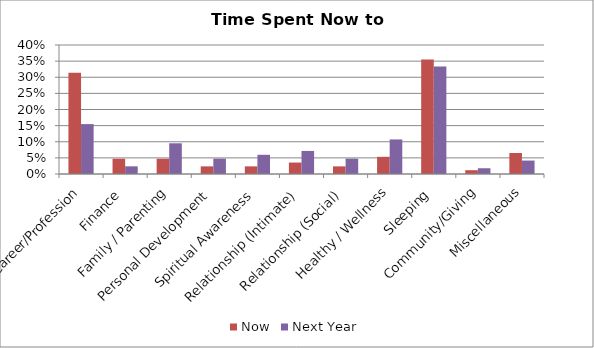
| Category | Now | Next Year |
|---|---|---|
| Career/Profession | 0.314 | 0.155 |
| Finance | 0.047 | 0.024 |
| Family / Parenting | 0.047 | 0.095 |
| Personal Development | 0.024 | 0.048 |
| Spiritual Awareness | 0.024 | 0.06 |
| Relationship (Intimate) | 0.036 | 0.071 |
| Relationship (Social) | 0.024 | 0.048 |
| Healthy / Wellness | 0.053 | 0.107 |
| Sleeping | 0.355 | 0.333 |
| Community/Giving | 0.012 | 0.018 |
| Miscellaneous | 0.065 | 0.042 |